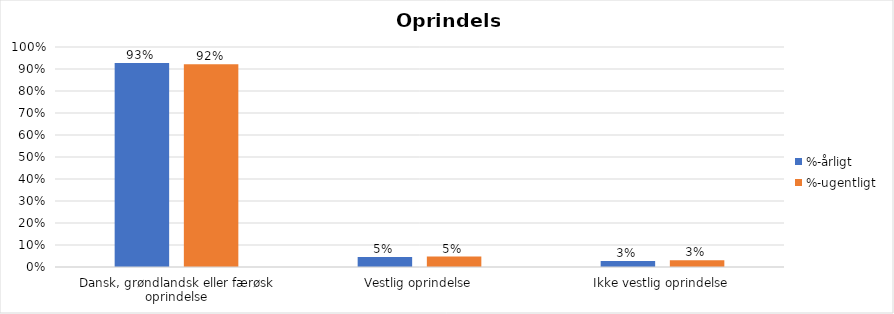
| Category | %-årligt | %-ugentligt |
|---|---|---|
| Dansk, grøndlandsk eller færøsk oprindelse | 0.927 | 0.922 |
| Vestlig oprindelse | 0.045 | 0.047 |
| Ikke vestlig oprindelse | 0.028 | 0.031 |